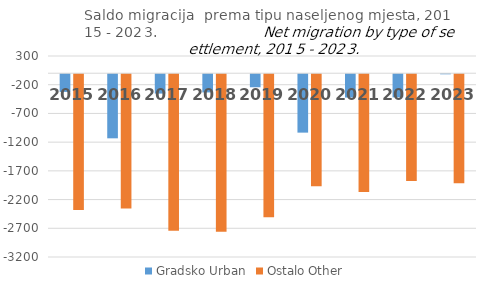
| Category | Gradsko Urban | Ostalo Other |
|---|---|---|
| 2015.0 | -308 | -2366 |
| 2016.0 | -1116 | -2339 |
| 2017.0 | -337 | -2724 |
| 2018.0 | -317 | -2744 |
| 2019.0 | -227 | -2490 |
| 2020.0 | -1017 | -1951 |
| 2021.0 | -406 | -2050 |
| 2022.0 | -403 | -1859 |
| 2023.0 | -1 | -1900 |